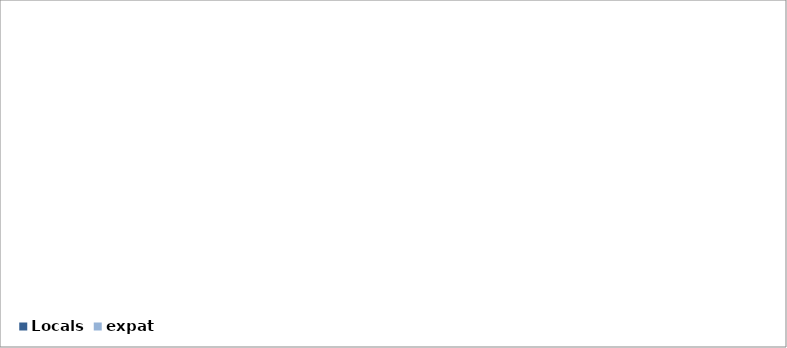
| Category | expat | Locals |
|---|---|---|
| Nurses | 46.749 | 53.251 |
| Doctors (MBBS) | 80.2 | 19.8 |
| Doctors (Specialists) | 64.16 | 35.84 |
| Laboratory Scientists / Laboratory technicians/ laboratory assistants  | 47.674 | 52.326 |
| Family  Health Workers | 0 | 100 |
| Community Health Workers | 0 | 100 |
| Radiographers | 77.778 | 22.222 |
| Foolhumaas (TBAs) | 0 | 100 |
|  Dental technicians / dental assistants | 9.091 | 90.909 |
| Physiotherapists | 72.222 | 27.778 |